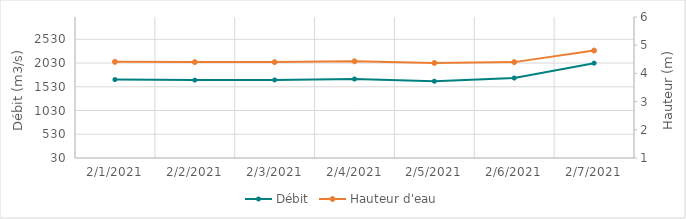
| Category | Débit |
|---|---|
| 2/2/21 | 1670.12 |
| 2/1/21 | 1683.05 |
| 1/31/21 | 1716.54 |
| 1/30/21 | 1784.98 |
| 1/29/21 | 1873.71 |
| 1/28/21 | 1896.31 |
| 1/27/21 | 1709.12 |